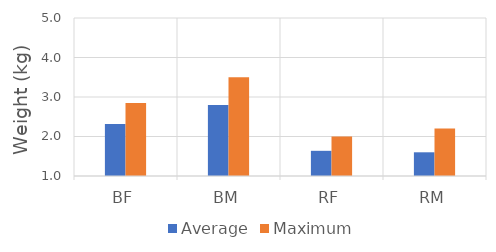
| Category | Average | Maximum |
|---|---|---|
| BF | 2.317 | 2.85 |
| BM | 2.8 | 3.5 |
| RF | 1.638 | 2 |
| RM | 1.6 | 2.2 |